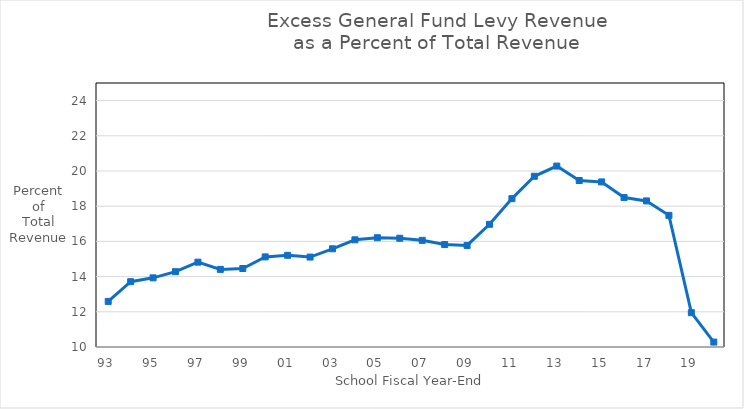
| Category | Series 0 |
|---|---|
| 93 | 12.59 |
| 94 | 13.71 |
| 95 | 13.93 |
| 96 | 14.28 |
| 97 | 14.82 |
| 98 | 14.41 |
| 99 | 14.46 |
| 00 | 15.12 |
| 01 | 15.21 |
| 02 | 15.11 |
| 03 | 15.58 |
| 04 | 16.09 |
| 05 | 16.21 |
| 06 | 16.18 |
| 07 | 16.06 |
| 08 | 15.82 |
| 09 | 15.77 |
| 10 | 16.97 |
| 11 | 18.43 |
| 12 | 19.7 |
| 13 | 20.28 |
| 14 | 19.46 |
| 15 | 19.38 |
| 16 | 18.49 |
| 17 | 18.3 |
| 18 | 17.48 |
| 19 | 11.95 |
| 20 | 10.28 |